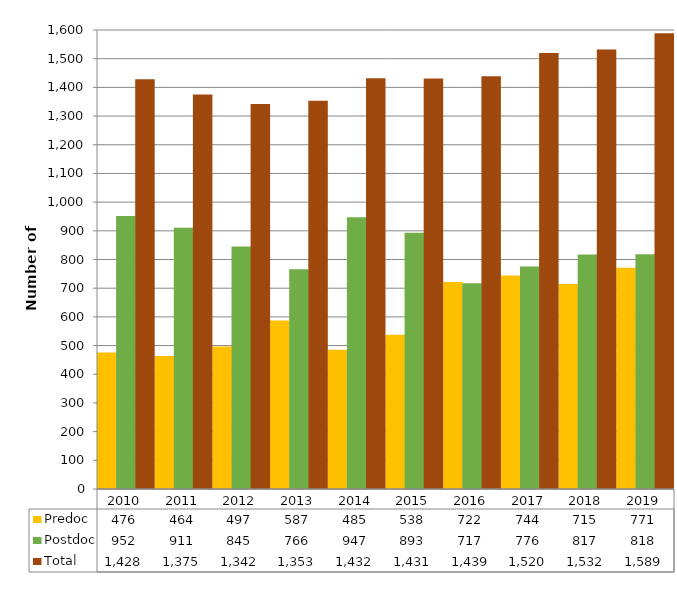
| Category | Predoc | Postdoc | Total |
|---|---|---|---|
| 2010.0 | 476 | 952 | 1428 |
| 2011.0 | 464 | 911 | 1375 |
| 2012.0 | 497 | 845 | 1342 |
| 2013.0 | 587 | 766 | 1353 |
| 2014.0 | 485 | 947 | 1432 |
| 2015.0 | 538 | 893 | 1431 |
| 2016.0 | 722 | 717 | 1439 |
| 2017.0 | 744 | 776 | 1520 |
| 2018.0 | 715 | 817 | 1532 |
| 2019.0 | 771 | 818 | 1589 |